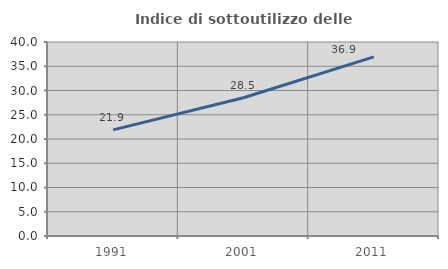
| Category | Indice di sottoutilizzo delle abitazioni  |
|---|---|
| 1991.0 | 21.875 |
| 2001.0 | 28.502 |
| 2011.0 | 36.937 |